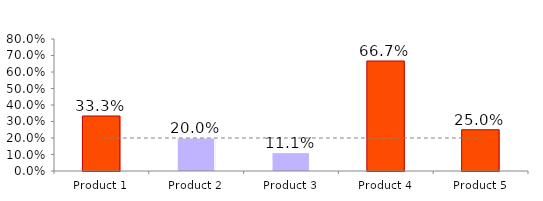
| Category | Series 0 |
|---|---|
| Product 1 | 0.333 |
| Product 2 | 0.2 |
| Product 3 | 0.111 |
| Product 4 | 0.667 |
| Product 5 | 0.25 |